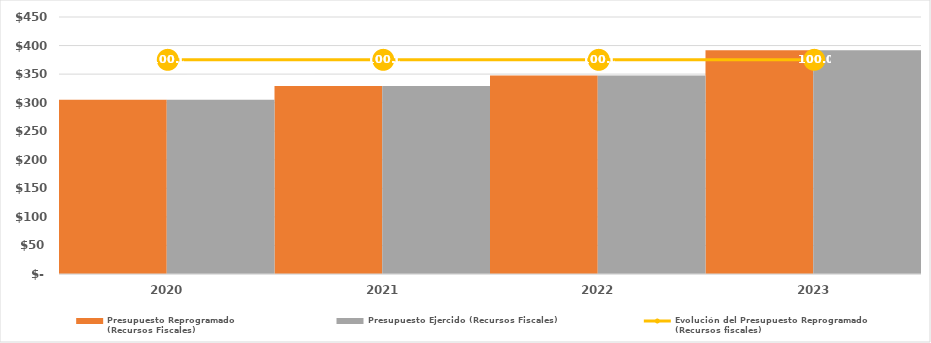
| Category | Presupuesto Reprogramado
(Recursos Fiscales) | Presupuesto Ejercido (Recursos Fiscales) |
|---|---|---|
| 2020.0 | 305075.357 | 305075.357 |
| 2021.0 | 329095.471 | 329095.471 |
| 2022.0 | 347679.642 | 347679.642 |
| 2023.0 | 391664.656 | 391664.656 |